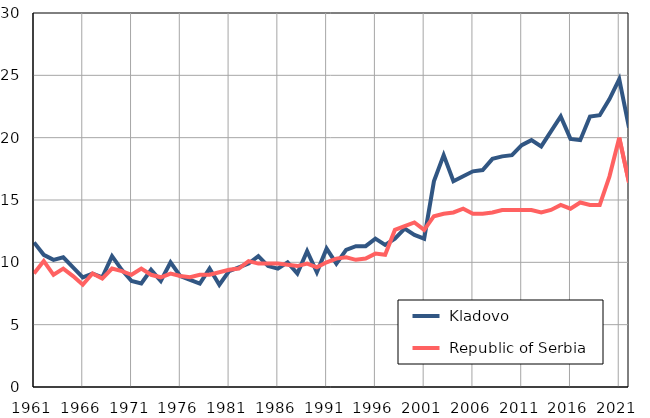
| Category |  Kladovo |  Republic of Serbia |
|---|---|---|
| 1961.0 | 11.6 | 9.1 |
| 1962.0 | 10.6 | 10.1 |
| 1963.0 | 10.2 | 9 |
| 1964.0 | 10.4 | 9.5 |
| 1965.0 | 9.6 | 8.9 |
| 1966.0 | 8.8 | 8.2 |
| 1967.0 | 9.1 | 9.1 |
| 1968.0 | 8.8 | 8.7 |
| 1969.0 | 10.5 | 9.5 |
| 1970.0 | 9.4 | 9.3 |
| 1971.0 | 8.5 | 9 |
| 1972.0 | 8.3 | 9.5 |
| 1973.0 | 9.4 | 9 |
| 1974.0 | 8.5 | 8.8 |
| 1975.0 | 10 | 9.1 |
| 1976.0 | 8.9 | 8.9 |
| 1977.0 | 8.6 | 8.8 |
| 1978.0 | 8.3 | 9 |
| 1979.0 | 9.5 | 9 |
| 1980.0 | 8.2 | 9.2 |
| 1981.0 | 9.3 | 9.4 |
| 1982.0 | 9.6 | 9.5 |
| 1983.0 | 9.9 | 10.1 |
| 1984.0 | 10.5 | 9.9 |
| 1985.0 | 9.7 | 9.9 |
| 1986.0 | 9.5 | 9.9 |
| 1987.0 | 10 | 9.8 |
| 1988.0 | 9.1 | 9.7 |
| 1989.0 | 10.9 | 9.9 |
| 1990.0 | 9.2 | 9.6 |
| 1991.0 | 11.1 | 10 |
| 1992.0 | 9.9 | 10.3 |
| 1993.0 | 11 | 10.4 |
| 1994.0 | 11.3 | 10.2 |
| 1995.0 | 11.3 | 10.3 |
| 1996.0 | 11.9 | 10.7 |
| 1997.0 | 11.4 | 10.6 |
| 1998.0 | 11.9 | 12.6 |
| 1999.0 | 12.7 | 12.9 |
| 2000.0 | 12.2 | 13.2 |
| 2001.0 | 11.9 | 12.6 |
| 2002.0 | 16.5 | 13.7 |
| 2003.0 | 18.6 | 13.9 |
| 2004.0 | 16.5 | 14 |
| 2005.0 | 16.9 | 14.3 |
| 2006.0 | 17.3 | 13.9 |
| 2007.0 | 17.4 | 13.9 |
| 2008.0 | 18.3 | 14 |
| 2009.0 | 18.5 | 14.2 |
| 2010.0 | 18.6 | 14.2 |
| 2011.0 | 19.4 | 14.2 |
| 2012.0 | 19.8 | 14.2 |
| 2013.0 | 19.3 | 14 |
| 2014.0 | 20.5 | 14.2 |
| 2015.0 | 21.7 | 14.6 |
| 2016.0 | 19.9 | 14.3 |
| 2017.0 | 19.8 | 14.8 |
| 2018.0 | 21.7 | 14.6 |
| 2019.0 | 21.8 | 14.6 |
| 2020.0 | 23.1 | 16.9 |
| 2021.0 | 24.7 | 20 |
| 2022.0 | 20.8 | 16.4 |